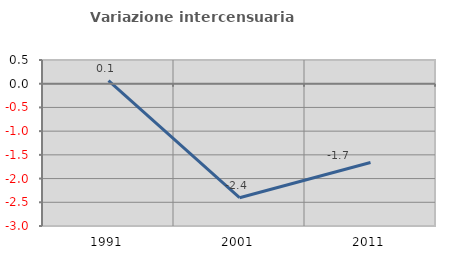
| Category | Variazione intercensuaria annua |
|---|---|
| 1991.0 | 0.064 |
| 2001.0 | -2.403 |
| 2011.0 | -1.662 |